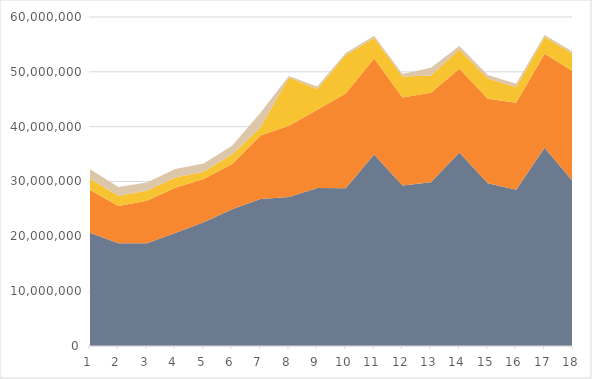
| Category | Series 0 | Series 1 | Series 2 | Series 3 |
|---|---|---|---|---|
| 0 | 20668561 | 7776584 | 2060434 | 1709601 |
| 1 | 18744221 | 6792309 | 1865859 | 1609740 |
| 2 | 18743074 | 7742262 | 1843832 | 1500000 |
| 3 | 20592452 | 8269422 | 1846695 | 1571480 |
| 4 | 22588207 | 7869064 | 1309671 | 1502403 |
| 5 | 24944265 | 8236128 | 1732497 | 1618235 |
| 6 | 26819007 | 11566472 | 1463058 | 2685374 |
| 7 | 27160985 | 12996244 | 8807695 | 260529 |
| 8 | 28816591 | 14257860 | 3805844 | 456899 |
| 9 | 28751689 | 17296250 | 7035987 | 353162 |
| 10 | 34905970 | 17515889 | 3737148 | 424614 |
| 11 | 29277258 | 16063081 | 3830031 | 448116 |
| 12 | 29871098 | 16292407 | 3145207 | 1446460 |
| 13 | 35309134 | 15242894 | 3516140 | 638501 |
| 14 | 29694990 | 15387516 | 3680948 | 671331 |
| 15 | 28514480.39 | 15857086.86 | 2825119 | 647293 |
| 16 | 36166442 | 17116031 | 3071168 | 360575 |
| 17 | 30020259 | 20053079.52 | 3209960 | 385479 |